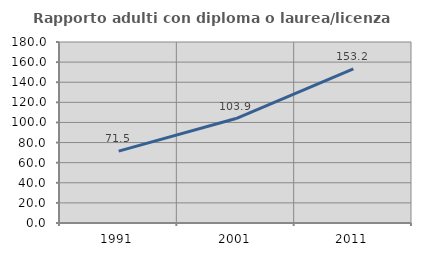
| Category | Rapporto adulti con diploma o laurea/licenza media  |
|---|---|
| 1991.0 | 71.525 |
| 2001.0 | 103.863 |
| 2011.0 | 153.158 |